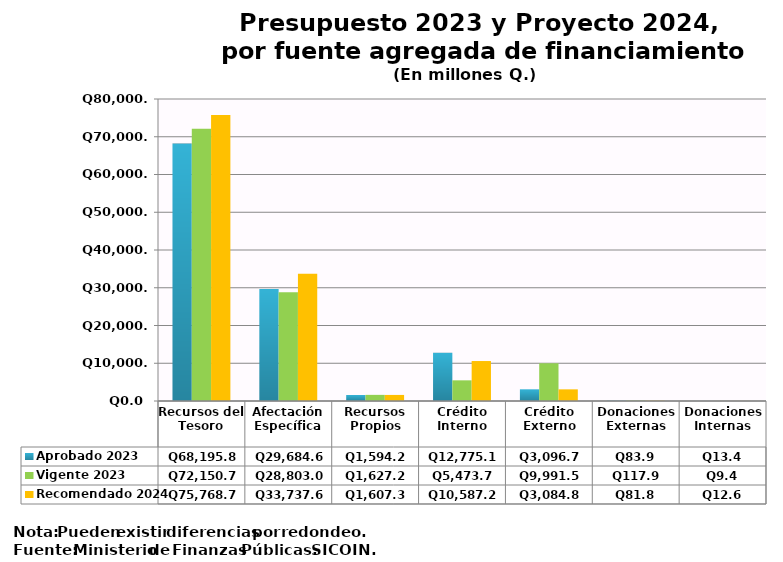
| Category | Aprobado 2023 | Vigente 2023 | Recomendado 2024 |
|---|---|---|---|
| Recursos del Tesoro | 68195.8 | 72150.7 | 75768.7 |
| Afectación Específica | 29684.6 | 28803 | 33737.6 |
| Recursos Propios | 1594.2 | 1627.2 | 1607.3 |
| Crédito Interno | 12775.1 | 5473.7 | 10587.2 |
| Crédito Externo | 3096.7 | 9991.5 | 3084.8 |
| Donaciones Externas | 83.9 | 117.9 | 81.8 |
| Donaciones Internas | 13.4 | 9.4 | 12.6 |